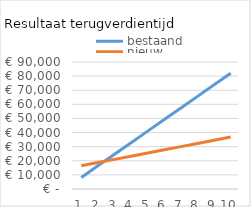
| Category | bestaand | nieuw |
|---|---|---|
| 1.0 | 8204.971 | 16467.92 |
| 2.0 | 16409.941 | 18725.84 |
| 3.0 | 24614.912 | 20983.76 |
| 4.0 | 32819.883 | 23241.68 |
| 5.0 | 41024.853 | 25499.6 |
| 6.0 | 49229.824 | 27757.52 |
| 7.0 | 57434.795 | 30015.44 |
| 8.0 | 65639.765 | 32273.36 |
| 9.0 | 73844.736 | 34531.28 |
| 10.0 | 82049.707 | 36789.2 |